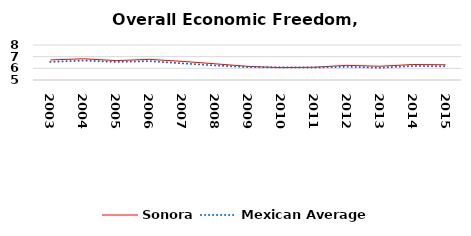
| Category | Sonora | Mexican Average  |
|---|---|---|
| 2003.0 | 6.719 | 6.552 |
| 2004.0 | 6.818 | 6.668 |
| 2005.0 | 6.663 | 6.546 |
| 2006.0 | 6.77 | 6.619 |
| 2007.0 | 6.596 | 6.428 |
| 2008.0 | 6.39 | 6.248 |
| 2009.0 | 6.169 | 6.106 |
| 2010.0 | 6.06 | 6.086 |
| 2011.0 | 6.095 | 6.074 |
| 2012.0 | 6.255 | 6.134 |
| 2013.0 | 6.178 | 6.054 |
| 2014.0 | 6.327 | 6.2 |
| 2015.0 | 6.305 | 6.174 |